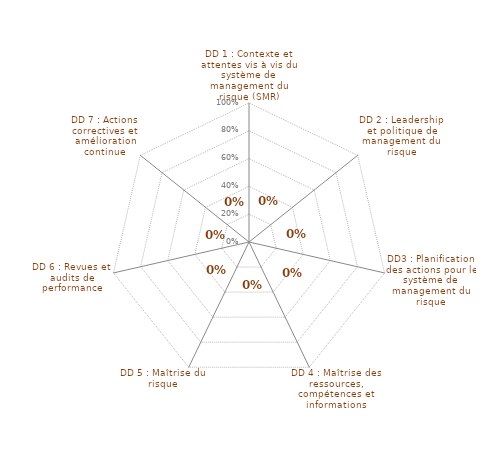
| Category | Maîtrise estimée des Dossiers documentaires (DD) |
|---|---|
| DD 1 : Contexte et attentes vis à vis du système de management du risque (SMR) | 0 |
| DD 2 : Leadership et politique de management du risque | 0 |
| DD3 : Planification des actions pour le système de management du risque | 0 |
| DD 4 : Maîtrise des ressources, compétences et informations | 0 |
| DD 5 : Maîtrise du risque | 0 |
| DD 6 : Revues et audits de performance | 0 |
| DD 7 : Actions correctives et amélioration continue | 0 |